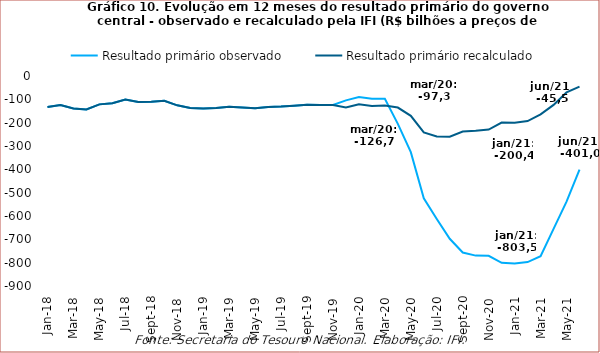
| Category | Resultado primário observado | Resultado primário recalculado |
|---|---|---|
| 2018-01-01 | -133.247 | -133.247 |
| 2018-02-01 | -124.069 | -124.069 |
| 2018-03-01 | -139.176 | -139.176 |
| 2018-04-01 | -143.795 | -143.795 |
| 2018-05-01 | -121.557 | -121.557 |
| 2018-06-01 | -116.598 | -116.598 |
| 2018-07-01 | -101.127 | -101.127 |
| 2018-08-01 | -111.537 | -111.537 |
| 2018-09-01 | -110.595 | -110.595 |
| 2018-10-01 | -105.842 | -105.842 |
| 2018-11-01 | -125.702 | -125.702 |
| 2018-12-01 | -136.936 | -136.936 |
| 2019-01-01 | -139.165 | -139.165 |
| 2019-02-01 | -137.217 | -137.217 |
| 2019-03-01 | -132.17 | -132.17 |
| 2019-04-01 | -135.038 | -135.038 |
| 2019-05-01 | -138.582 | -138.582 |
| 2019-06-01 | -132.91 | -132.91 |
| 2019-07-01 | -130.927 | -130.927 |
| 2019-08-01 | -127.054 | -127.054 |
| 2019-09-01 | -123.5 | -123.5 |
| 2019-10-01 | -124.675 | -124.675 |
| 2019-11-01 | -124.483 | -124.483 |
| 2019-12-01 | -104.444 | -135.027 |
| 2020-01-01 | -90.543 | -121.127 |
| 2020-02-01 | -97.988 | -128.572 |
| 2020-03-01 | -97.284 | -126.748 |
| 2020-04-01 | -205.157 | -135.17 |
| 2020-05-01 | -326.404 | -170.765 |
| 2020-06-01 | -524.458 | -241.819 |
| 2020-07-01 | -612.785 | -259.295 |
| 2020-08-01 | -697.695 | -260.027 |
| 2020-09-01 | -756.586 | -237.748 |
| 2020-10-01 | -769.788 | -235.002 |
| 2020-11-01 | -770.806 | -229.64 |
| 2020-12-01 | -800.727 | -199.784 |
| 2021-01-01 | -803.459 | -200.422 |
| 2021-02-01 | -797.443 | -193.317 |
| 2021-03-01 | -772.576 | -164.313 |
| 2021-04-01 | -655.051 | -123.867 |
| 2021-05-01 | -538.559 | -70.397 |
| 2021-06-01 | -400.994 | -45.459 |